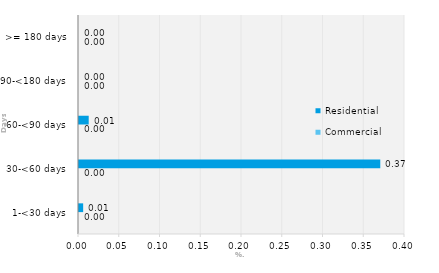
| Category | Commercial | Residential |
|---|---|---|
| 1-<30 days | 0 | 0.005 |
| 30-<60 days | 0 | 0.37 |
| 60-<90 days | 0 | 0.012 |
| 90-<180 days | 0 | 0 |
| >= 180 days | 0 | 0 |